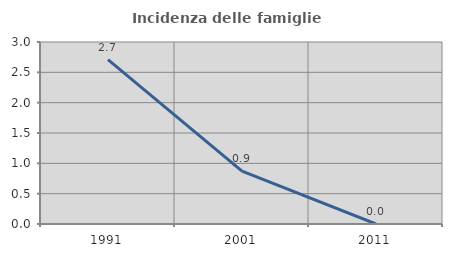
| Category | Incidenza delle famiglie numerose |
|---|---|
| 1991.0 | 2.711 |
| 2001.0 | 0.872 |
| 2011.0 | 0 |